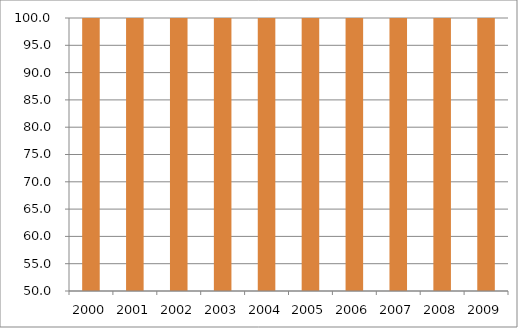
| Category | Região Norte |
|---|---|
| 2000.0 | 111.66 |
| 2001.0 | 119.05 |
| 2002.0 | 119.11 |
| 2003.0 | 115.16 |
| 2004.0 | 106.99 |
| 2005.0 | 115.14 |
| 2006.0 | 131.57 |
| 2007.0 | 127.22 |
| 2008.0 | 122.22 |
| 2009.0 | 115.26 |